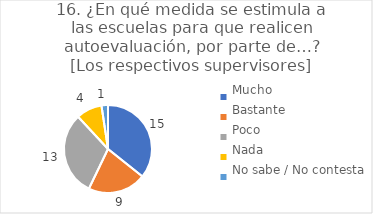
| Category | 16. ¿En qué medida se estimula a las escuelas para que realicen autoevaluación, por parte de…?
[Los respectivos supervisores] |
|---|---|
| Mucho  | 0.357 |
| Bastante  | 0.214 |
| Poco  | 0.31 |
| Nada  | 0.095 |
| No sabe / No contesta | 0.024 |